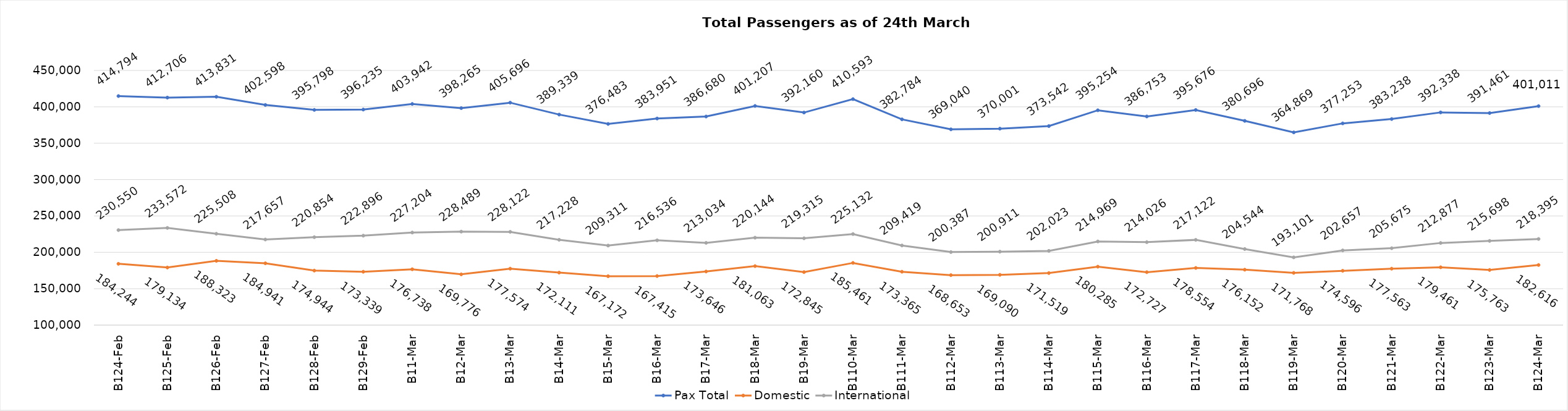
| Category | Pax Total | Domestic | International |
|---|---|---|---|
| 2024-02-24 | 414794 | 184244 | 230550 |
| 2024-02-25 | 412706 | 179134 | 233572 |
| 2024-02-26 | 413831 | 188323 | 225508 |
| 2024-02-27 | 402598 | 184941 | 217657 |
| 2024-02-28 | 395798 | 174944 | 220854 |
| 2024-02-29 | 396235 | 173339 | 222896 |
| 2024-03-01 | 403942 | 176738 | 227204 |
| 2024-03-02 | 398265 | 169776 | 228489 |
| 2024-03-03 | 405696 | 177574 | 228122 |
| 2024-03-04 | 389339 | 172111 | 217228 |
| 2024-03-05 | 376483 | 167172 | 209311 |
| 2024-03-06 | 383951 | 167415 | 216536 |
| 2024-03-07 | 386680 | 173646 | 213034 |
| 2024-03-08 | 401207 | 181063 | 220144 |
| 2024-03-09 | 392160 | 172845 | 219315 |
| 2024-03-10 | 410593 | 185461 | 225132 |
| 2024-03-11 | 382784 | 173365 | 209419 |
| 2024-03-12 | 369040 | 168653 | 200387 |
| 2024-03-13 | 370001 | 169090 | 200911 |
| 2024-03-14 | 373542 | 171519 | 202023 |
| 2024-03-15 | 395254 | 180285 | 214969 |
| 2024-03-16 | 386753 | 172727 | 214026 |
| 2024-03-17 | 395676 | 178554 | 217122 |
| 2024-03-18 | 380696 | 176152 | 204544 |
| 2024-03-19 | 364869 | 171768 | 193101 |
| 2024-03-20 | 377253 | 174596 | 202657 |
| 2024-03-21 | 383238 | 177563 | 205675 |
| 2024-03-22 | 392338 | 179461 | 212877 |
| 2024-03-23 | 391461 | 175763 | 215698 |
| 2024-03-24 | 401011 | 182616 | 218395 |